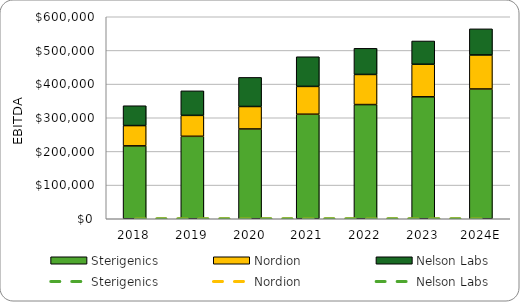
| Category | Sterigenics | Nordion | Nelson Labs |
|---|---|---|---|
| 2018 | 216490 | 60288 | 58915 |
| 2019 | 244904 | 62196 | 72832 |
| 2020 | 266639 | 66803 | 86417 |
| 2021 | 310470 | 82673 | 88086 |
| 2022 | 339144 | 89477 | 77628 |
| 2023 | 362212 | 96679 | 69139 |
| 2024E | 385401.001 | 101089.17 | 77594.65 |